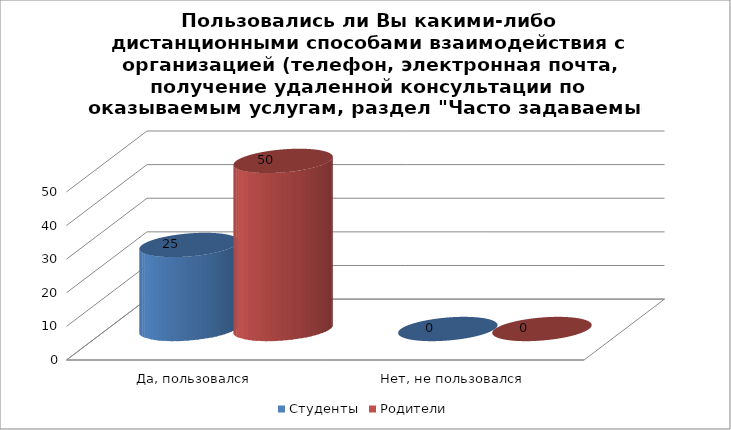
| Category | Студенты | Родители |
|---|---|---|
| Да, пользовался | 25 | 50 |
| Нет, не пользовался | 0 | 0 |